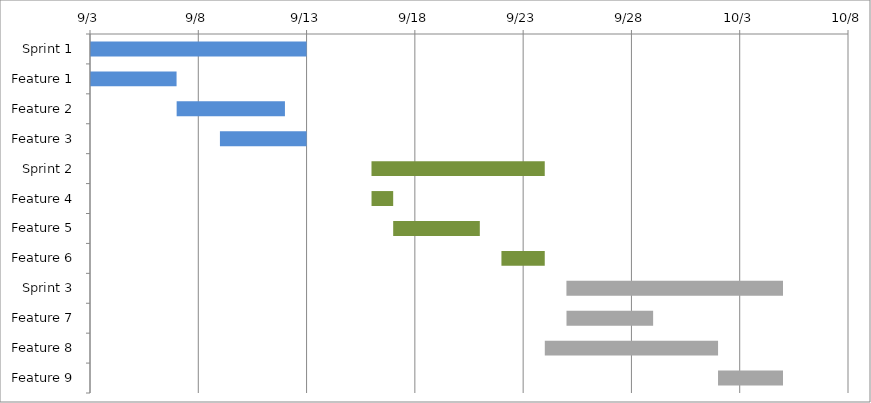
| Category | Start | Days |
|---|---|---|
| Sprint 1 | 2016-09-03 | 10 |
| Feature 1 | 2016-09-03 | 4 |
| Feature 2 | 2016-09-07 | 5 |
| Feature 3 | 2016-09-09 | 4 |
| Sprint 2 | 2016-09-16 | 8 |
| Feature 4 | 2016-09-16 | 1 |
| Feature 5 | 2016-09-17 | 4 |
| Feature 6 | 2016-09-22 | 2 |
| Sprint 3 | 2016-09-25 | 10 |
| Feature 7 | 2016-09-25 | 4 |
| Feature 8 | 2016-09-24 | 8 |
| Feature 9 | 2016-10-02 | 3 |